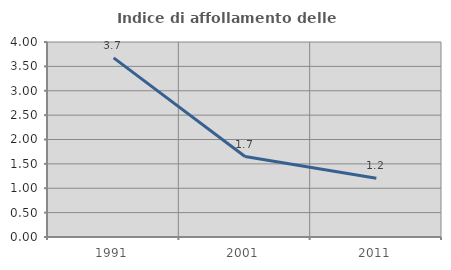
| Category | Indice di affollamento delle abitazioni  |
|---|---|
| 1991.0 | 3.675 |
| 2001.0 | 1.65 |
| 2011.0 | 1.205 |